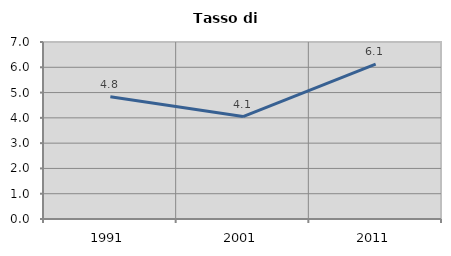
| Category | Tasso di disoccupazione   |
|---|---|
| 1991.0 | 4.835 |
| 2001.0 | 4.053 |
| 2011.0 | 6.126 |